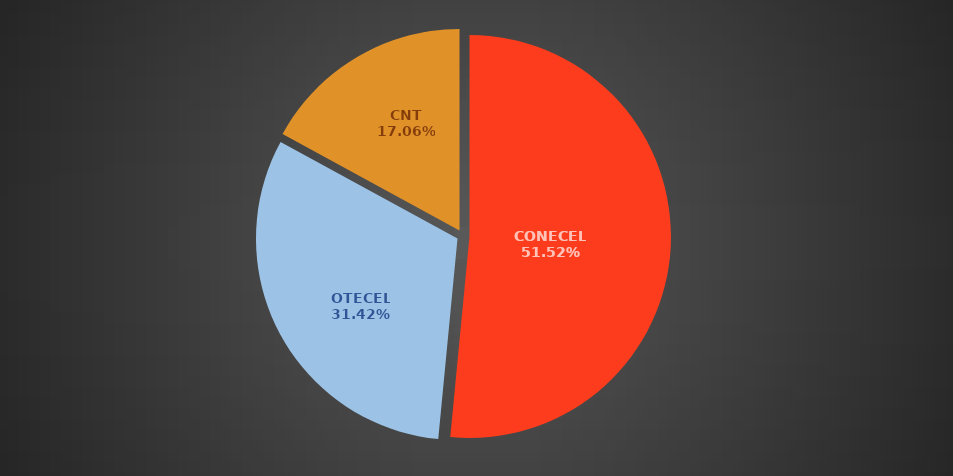
| Category | Abr 2022 |
|---|---|
| CONECEL | 8773356 |
| OTECEL | 5349789 |
| CNT | 2904652 |